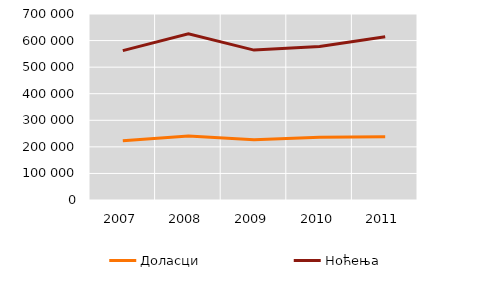
| Category | Доласци | Ноћења |
|---|---|---|
| 2007.0 | 222729 | 561995 |
| 2008.0 | 241145 | 625842 |
| 2009.0 | 226957 | 564091 |
| 2010.0 | 236286 | 577802 |
| 2011.0 | 237794 | 614637 |